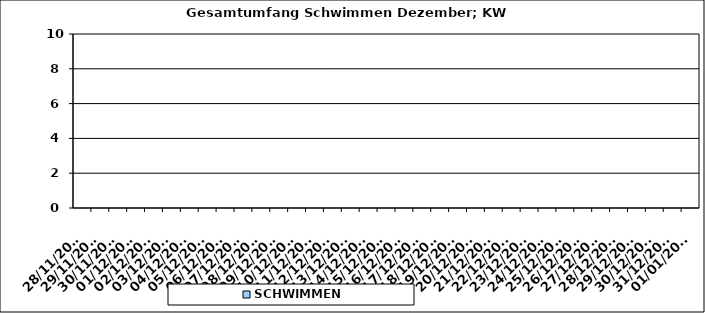
| Category | SCHWIMMEN |
|---|---|
| 28/11/2022 | 0 |
| 29/11/2022 | 0 |
| 30/11/2022 | 0 |
| 01/12/2022 | 0 |
| 02/12/2022 | 0 |
| 03/12/2022 | 0 |
| 04/12/2022 | 0 |
| 05/12/2022 | 0 |
| 06/12/2022 | 0 |
| 07/12/2022 | 0 |
| 08/12/2022 | 0 |
| 09/12/2022 | 0 |
| 10/12/2022 | 0 |
| 11/12/2022 | 0 |
| 12/12/2022 | 0 |
| 13/12/2022 | 0 |
| 14/12/2022 | 0 |
| 15/12/2022 | 0 |
| 16/12/2022 | 0 |
| 17/12/2022 | 0 |
| 18/12/2022 | 0 |
| 19/12/2022 | 0 |
| 20/12/2022 | 0 |
| 21/12/2022 | 0 |
| 22/12/2022 | 0 |
| 23/12/2022 | 0 |
| 24/12/2022 | 0 |
| 25/12/2022 | 0 |
| 26/12/2022 | 0 |
| 27/12/2022 | 0 |
| 28/12/2022 | 0 |
| 29/12/2022 | 0 |
| 30/12/2022 | 0 |
| 31/12/2022 | 0 |
| 01/01/2023 | 0 |